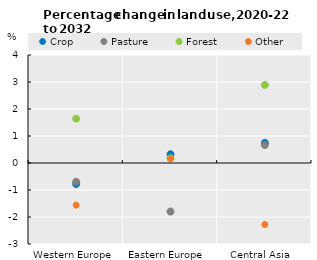
| Category | Crop | Pasture | Forest | Other |
|---|---|---|---|---|
| Western Europe | -0.779 | -0.693 | 1.642 | -1.56 |
| Eastern Europe  | 0.326 | -1.799 | 0.175 | 0.166 |
| Central Asia  | 0.747 | 0.664 | 2.891 | -2.28 |